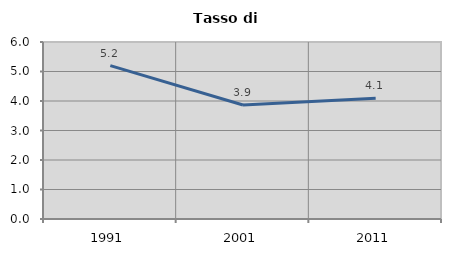
| Category | Tasso di disoccupazione   |
|---|---|
| 1991.0 | 5.2 |
| 2001.0 | 3.866 |
| 2011.0 | 4.09 |